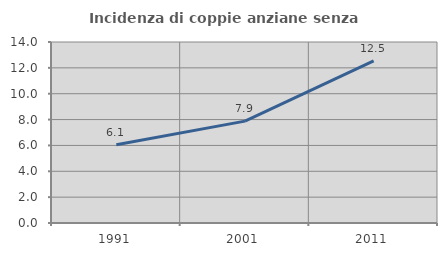
| Category | Incidenza di coppie anziane senza figli  |
|---|---|
| 1991.0 | 6.053 |
| 2001.0 | 7.879 |
| 2011.0 | 12.54 |